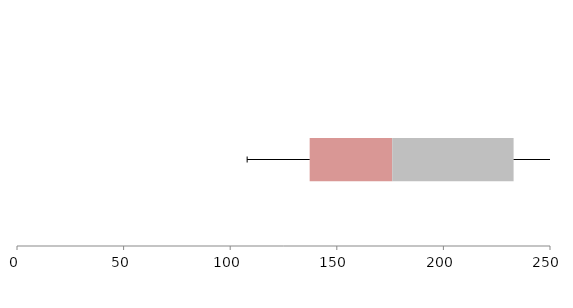
| Category | Series 1 | Series 2 | Series 3 |
|---|---|---|---|
| 0 | 137.273 | 38.723 | 56.928 |